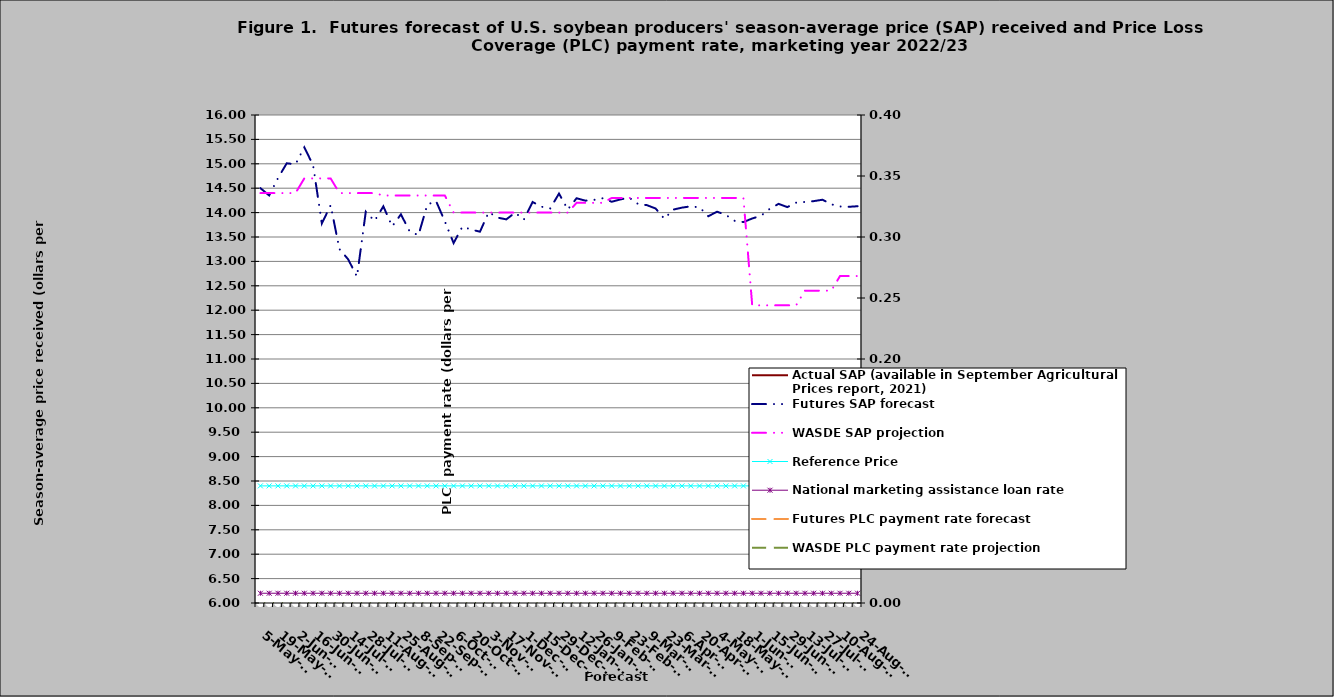
| Category | Actual SAP (available in September Agricultural Prices report, 2021) | Futures SAP forecast | WASDE SAP projection | Reference Price  | National marketing assistance loan rate  |
|---|---|---|---|---|---|
| 2022-05-05 |  | 14.501 | 14.4 | 8.4 | 6.2 |
| 2022-05-12 |  | 14.351 | 14.4 | 8.4 | 6.2 |
| 2022-05-19 |  | 14.707 | 14.4 | 8.4 | 6.2 |
| 2022-05-26 |  | 15.01 | 14.4 | 8.4 | 6.2 |
| 2022-06-02 |  | 14.991 | 14.4 | 8.4 | 6.2 |
| 2022-06-09 |  | 15.339 | 14.7 | 8.4 | 6.2 |
| 2022-06-16 |  | 14.971 | 14.7 | 8.4 | 6.2 |
| 2022-06-23 |  | 13.779 | 14.7 | 8.4 | 6.2 |
| 2022-06-30 |  | 14.149 | 14.7 | 8.4 | 6.2 |
| 2022-07-07 |  | 13.252 | 14.4 | 8.4 | 6.2 |
| 2022-07-14 |  | 13.041 | 14.4 | 8.4 | 6.2 |
| 2022-07-21 |  | 12.687 | 14.4 | 8.4 | 6.2 |
| 2022-07-28 |  | 14.018 | 14.4 | 8.4 | 6.2 |
| 2022-08-04 |  | 13.828 | 14.4 | 8.4 | 6.2 |
| 2022-08-11 |  | 14.128 | 14.35 | 8.4 | 6.2 |
| 2022-08-18 |  | 13.719 | 14.35 | 8.4 | 6.2 |
| 2022-08-25 |  | 13.964 | 14.35 | 8.4 | 6.2 |
| 2022-09-01 |  | 13.614 | 14.35 | 8.4 | 6.2 |
| 2022-09-08 |  | 13.537 | 14.35 | 8.4 | 6.2 |
| 2022-09-15 |  | 14.162 | 14.35 | 8.4 | 6.2 |
| 2022-09-22 |  | 14.237 | 14.35 | 8.4 | 6.2 |
| 2022-09-29 |  | 13.822 | 14.35 | 8.4 | 6.2 |
| 2022-10-06 |  | 13.375 | 14 | 8.4 | 6.2 |
| 2022-10-13 |  | 13.712 | 14 | 8.4 | 6.2 |
| 2022-10-20 |  | 13.652 | 14 | 8.4 | 6.2 |
| 2022-10-27 |  | 13.608 | 14 | 8.4 | 6.2 |
| 2022-11-03 |  | 14.009 | 14 | 8.4 | 6.2 |
| 2022-11-10 |  | 13.898 | 14 | 8.4 | 6.2 |
| 2022-11-17 |  | 13.861 | 14 | 8.4 | 6.2 |
| 2022-11-24 |  | 13.999 | 14 | 8.4 | 6.2 |
| 2022-12-01 |  | 13.856 | 14 | 8.4 | 6.2 |
| 2022-12-08 |  | 14.217 | 14 | 8.4 | 6.2 |
| 2022-12-15 |  | 14.121 | 14 | 8.4 | 6.2 |
| 2022-12-22 |  | 14.086 | 14 | 8.4 | 6.2 |
| 2022-12-29 |  | 14.389 | 14 | 8.4 | 6.2 |
| 2023-01-05 |  | 14.063 | 14 | 8.4 | 6.2 |
| 2023-01-12 |  | 14.294 | 14.2 | 8.4 | 6.2 |
| 2023-01-19 |  | 14.245 | 14.2 | 8.4 | 6.2 |
| 2023-01-26 |  | 14.261 | 14.2 | 8.4 | 6.2 |
| 2023-02-02 |  | 14.294 | 14.2 | 8.4 | 6.2 |
| 2023-02-09 |  | 14.222 | 14.3 | 8.4 | 6.2 |
| 2023-02-16 |  | 14.271 | 14.3 | 8.4 | 6.2 |
| 2023-02-23 |  | 14.305 | 14.3 | 8.4 | 6.2 |
| 2023-03-02 |  | 14.176 | 14.3 | 8.4 | 6.2 |
| 2023-03-09 |  | 14.153 | 14.3 | 8.4 | 6.2 |
| 2023-03-16 |  | 14.084 | 14.3 | 8.4 | 6.2 |
| 2023-03-23 |  | 13.873 | 14.3 | 8.4 | 6.2 |
| 2023-03-30 |  | 14.061 | 14.3 | 8.4 | 6.2 |
| 2023-04-06 |  | 14.102 | 14.3 | 8.4 | 6.2 |
| 2023-04-13 |  | 14.128 | 14.3 | 8.4 | 6.2 |
| 2023-04-20 |  | 14.107 | 14.3 | 8.4 | 6.2 |
| 2023-04-27 |  | 13.926 | 14.3 | 8.4 | 6.2 |
| 2023-05-04 |  | 14.018 | 14.3 | 8.4 | 6.2 |
| 2023-05-11 |  | 13.952 | 14.3 | 8.4 | 6.2 |
| 2023-05-18 |  | 13.832 | 14.3 | 8.4 | 6.2 |
| 2023-05-25 |  | 13.806 | 14.3 | 8.4 | 6.2 |
| 2023-06-01 |  | 13.879 | 12.1 | 8.4 | 6.2 |
| 2023-06-08 |  | 13.935 | 12.1 | 8.4 | 6.2 |
| 2023-06-15 |  | 14.077 | 12.1 | 8.4 | 6.2 |
| 2023-06-22 |  | 14.179 | 12.1 | 8.4 | 6.2 |
| 2023-06-29 |  | 14.112 | 12.1 | 8.4 | 6.2 |
| 2023-07-06 |  | 14.203 | 12.1 | 8.4 | 6.2 |
| 2023-07-13 |  | 14.219 | 12.4 | 8.4 | 6.2 |
| 2023-07-20 |  | 14.235 | 12.4 | 8.4 | 6.2 |
| 2023-07-27 |  | 14.264 | 12.4 | 8.4 | 6.2 |
| 2023-08-03 |  | 14.171 | 12.4 | 8.4 | 6.2 |
| 2023-08-10 |  | 14.125 | 12.7 | 8.4 | 6.2 |
| 2023-08-17 |  | 14.119 | 12.7 | 8.4 | 6.2 |
| 2023-08-24 |  | 14.13 | 12.7 | 8.4 | 6.2 |